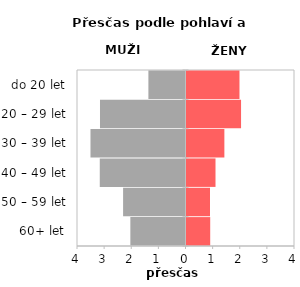
| Category | Přesčas |
|---|---|
| 60+ let | 0.874 |
| 50 – 59 let | 0.866 |
| 40 – 49 let | 1.069 |
| 30 – 39 let | 1.396 |
| 20 – 29 let | 2.011 |
| do 20 let | 1.953 |